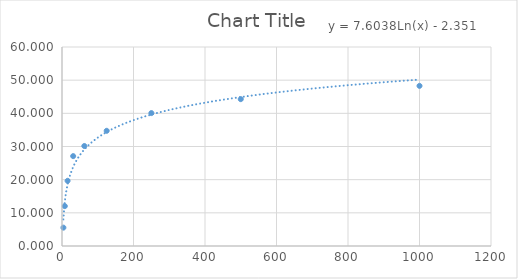
| Category | Series 0 |
|---|---|
| 3.91 | 5.534 |
| 7.81 | 12.023 |
| 15.62 | 19.656 |
| 31.25 | 27.099 |
| 62.5 | 30.153 |
| 125.0 | 34.733 |
| 250.0 | 40.076 |
| 500.0 | 44.275 |
| 1000.0 | 48.282 |